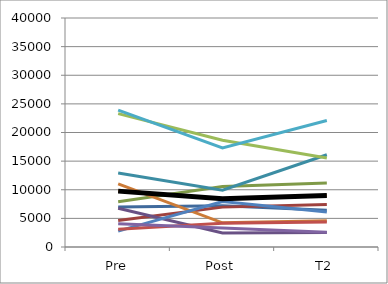
| Category | Series 0 | Series 1 | Series 2 | Series 3 | Series 4 | Series 5 | Series 6 | Series 7 | Series 8 | Series 9 | Series 10 | Series 11 | Mean |
|---|---|---|---|---|---|---|---|---|---|---|---|---|---|
| Pre | 6973 | 4612 | 7916 | 6779 | 12913 | 11030 | 2765 | 3100 | 23303 | 4054 | 23924 | 9760.818 | 9760.818 |
| Post | 7210 | 6965 | 10551 | 2460 | 9915 | 4230 | 7940 | 4143 | 18642.4 | 3309 | 17302 | 8424.309 | 8424.309 |
| T2 | 6403 | 7433 | 11170 | 2546 | 16121 | 4592 | 6118 | 4355 | 15535 | 2564 | 22109 | 8995.091 | 8995.091 |